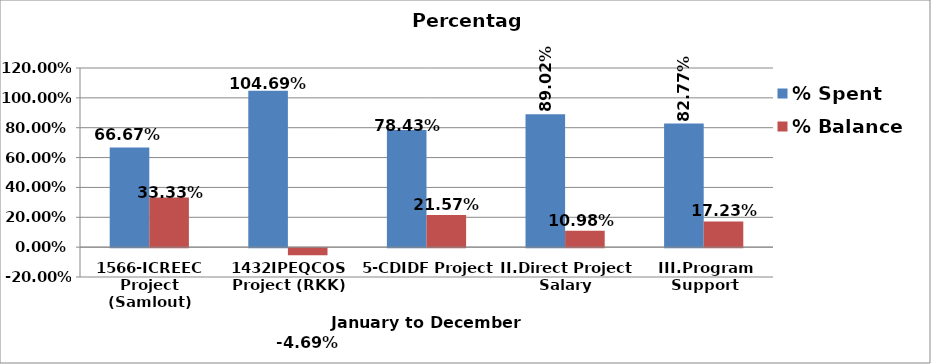
| Category | % Spent  | % Balance  |
|---|---|---|
| 1566-ICREEC Project (Samlout) | 0.667 | 0.333 |
| 1432IPEQCOS Project (RKK) | 1.047 | -0.047 |
| 5-CDIDF Project | 0.784 | 0.216 |
| II.Direct Project Salary | 0.89 | 0.11 |
| III.Program Support | 0.828 | 0.172 |